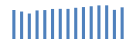
| Category | Exportações (1) |
|---|---|
| 0 | 392293.987 |
| 1 | 370979.678 |
| 2 | 344221.998 |
| 3 | 386156.652 |
| 4 | 390987.572 |
| 5 | 406063.094 |
| 6 | 407598.054 |
| 7 | 406953.169 |
| 8 | 421887.391 |
| 9 | 431264.801 |
| 10 | 442364.452 |
| 11 | 454202.095 |
| 12 | 454929.952 |
| 13 | 393954.142 |
| 14 | 427968.658 |